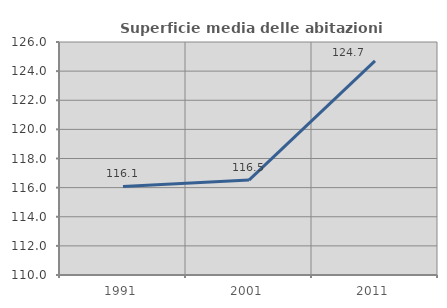
| Category | Superficie media delle abitazioni occupate |
|---|---|
| 1991.0 | 116.083 |
| 2001.0 | 116.519 |
| 2011.0 | 124.7 |